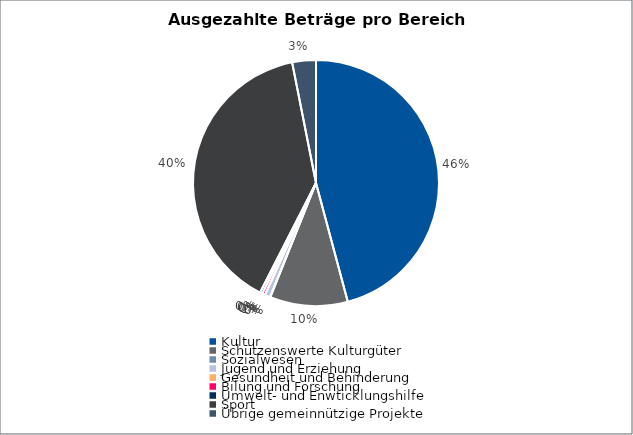
| Category | Series 0 |
|---|---|
| Kultur | 1113133.2 |
| Schützenswerte Kulturgüter | 248247 |
| Sozialwesen | 1000 |
| Jugend und Erziehung | 17300 |
| Gesundheit und Behinderung | 0 |
| Bilung und Forschung | 9000 |
| Umwelt- und Enwticklungshilfe | 8000 |
| Sport | 956168.31 |
| Übrige gemeinnützige Projekte | 75650 |